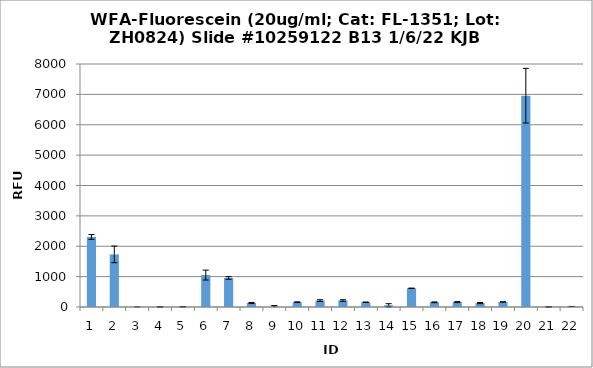
| Category | Series 0 |
|---|---|
| 0 | 2305.75 |
| 1 | 1732 |
| 2 | 1.5 |
| 3 | 3.5 |
| 4 | 7 |
| 5 | 1050.75 |
| 6 | 956 |
| 7 | 134.25 |
| 8 | -2 |
| 9 | 158.5 |
| 10 | 211.25 |
| 11 | 213.75 |
| 12 | 156.75 |
| 13 | 56.25 |
| 14 | 615.75 |
| 15 | 155 |
| 16 | 161 |
| 17 | 128.25 |
| 18 | 165.75 |
| 19 | 6957 |
| 20 | 3.5 |
| 21 | 5.5 |